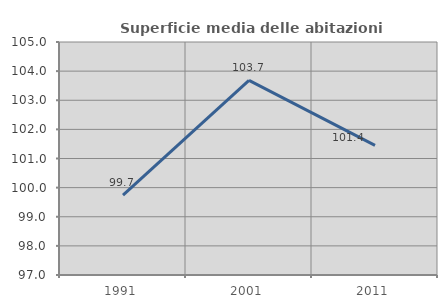
| Category | Superficie media delle abitazioni occupate |
|---|---|
| 1991.0 | 99.744 |
| 2001.0 | 103.681 |
| 2011.0 | 101.448 |